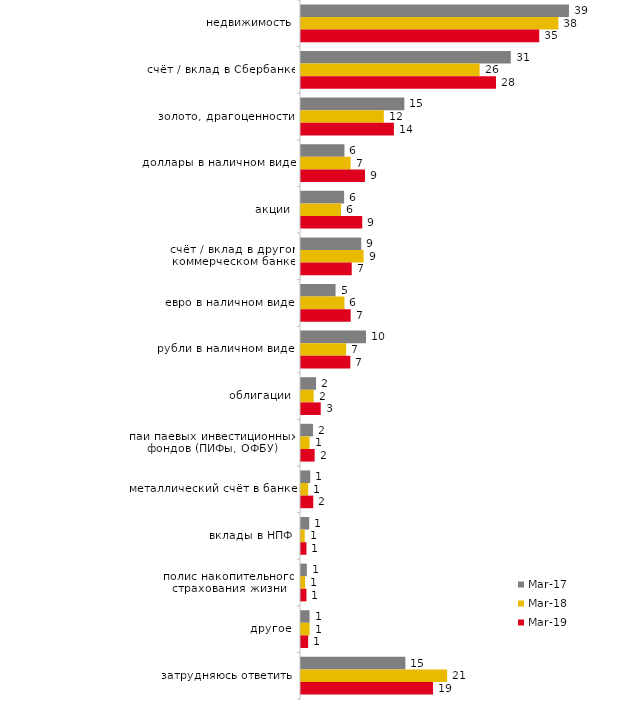
| Category | мар.17 | мар.18 | мар.19 |
|---|---|---|---|
| недвижимость | 39.15 | 37.6 | 34.809 |
| счёт / вклад в Сбербанке | 30.65 | 26.1 | 28.493 |
| золото, драгоценности | 15.1 | 12.1 | 13.575 |
| доллары в наличном виде | 6.35 | 7.25 | 9.349 |
| акции | 6.3 | 5.85 | 8.951 |
| счёт / вклад в другом коммерческом банке | 8.8 | 9.15 | 7.409 |
| евро в наличном виде | 5.05 | 6.35 | 7.26 |
| рубли в наличном виде | 9.5 | 6.6 | 7.21 |
| облигации | 2.2 | 1.85 | 2.884 |
| паи паевых инвестиционных фондов (ПИФы, ОФБУ) | 1.75 | 1.25 | 1.989 |
| металлический счёт в банке | 1.35 | 1.05 | 1.79 |
| вклады в НПФ | 1.2 | 0.55 | 0.796 |
| полис накопительного страхования жизни | 0.85 | 0.6 | 0.796 |
| другое | 1.25 | 1.25 | 1.044 |
| затрудняюсь ответить | 15.25 | 21.35 | 19.294 |